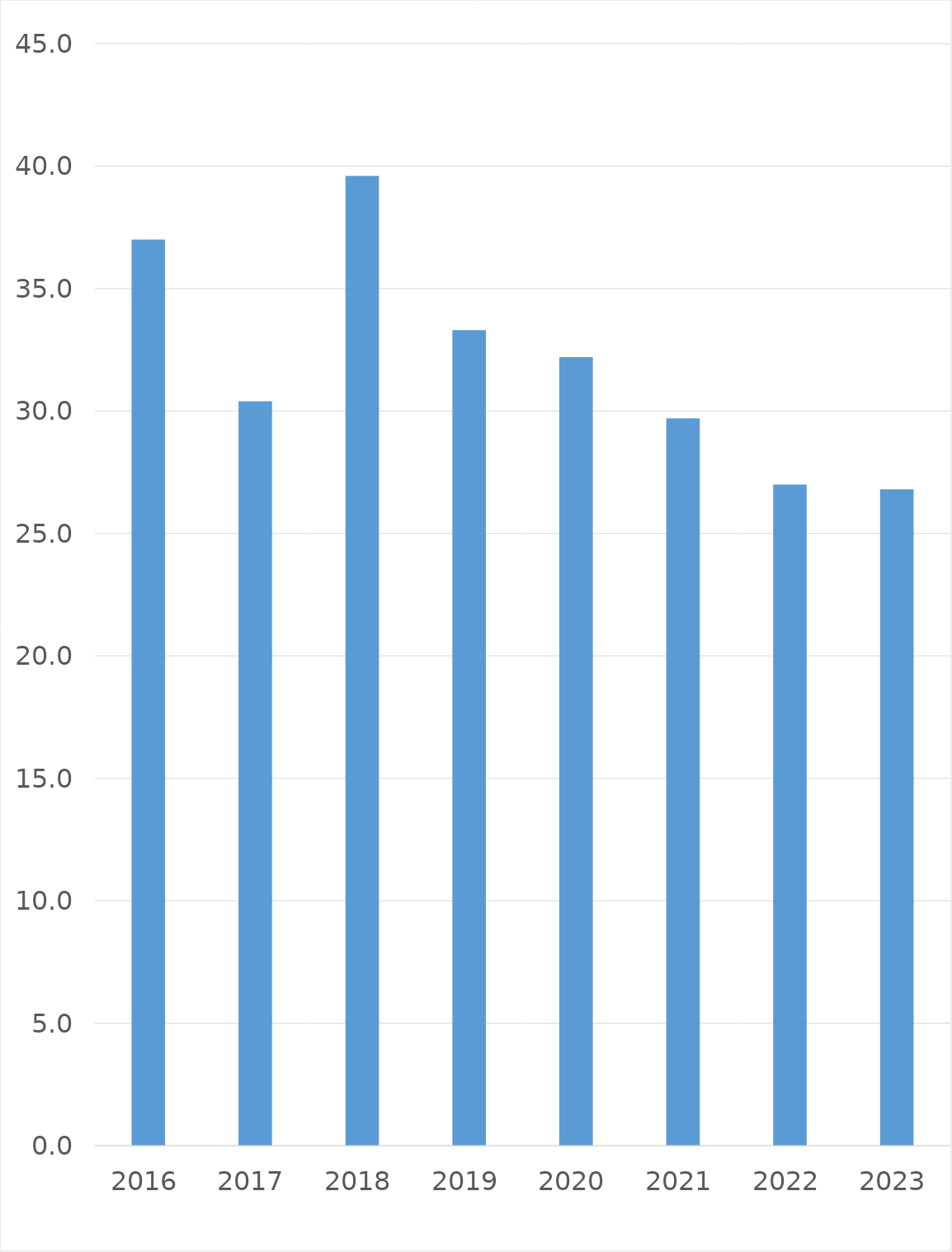
| Category | Series 0 |
|---|---|
| 2016 | 37 |
| 2017 | 30.4 |
| 2018 | 39.6 |
| 2019 | 33.3 |
| 2020 | 32.2 |
| 2021 | 29.7 |
| 2022 | 27 |
| 2023 | 26.8 |